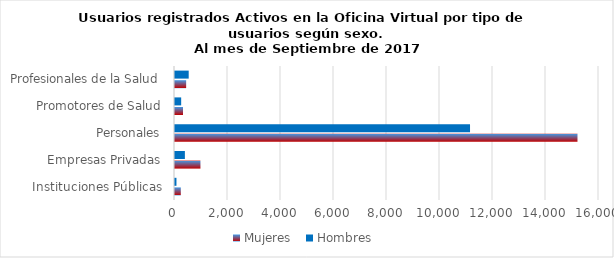
| Category | Mujeres | Hombres |
|---|---|---|
| Instituciones Públicas | 219 | 55 |
| Empresas Privadas | 960 | 373 |
| Personales | 15188 | 11133 |
| Promotores de Salud | 302 | 233 |
| Profesionales de la Salud | 421 | 517 |